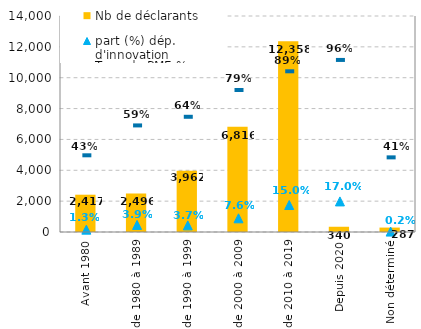
| Category | Nb de déclarants |
|---|---|
| Avant 1980 | 2417 |
| de 1980 à 1989 | 2496 |
| de 1990 à 1999 | 3962 |
| de 2000 à 2009 | 6816 |
| de 2010 à 2019 | 12358 |
| Depuis 2020 | 340 |
| Non déterminé | 287 |